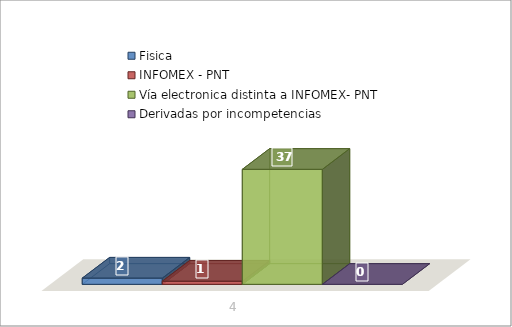
| Category | Fisica | INFOMEX - PNT | Vía electronica distinta a INFOMEX- PNT | Derivadas por incompetencias |
|---|---|---|---|---|
| 0 | 2 | 1 | 37 | 0 |